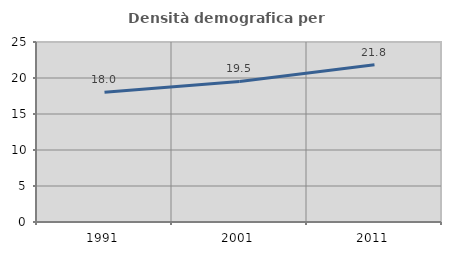
| Category | Densità demografica |
|---|---|
| 1991.0 | 18.022 |
| 2001.0 | 19.518 |
| 2011.0 | 21.83 |